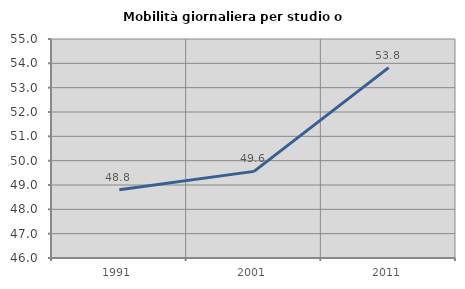
| Category | Mobilità giornaliera per studio o lavoro |
|---|---|
| 1991.0 | 48.801 |
| 2001.0 | 49.56 |
| 2011.0 | 53.824 |